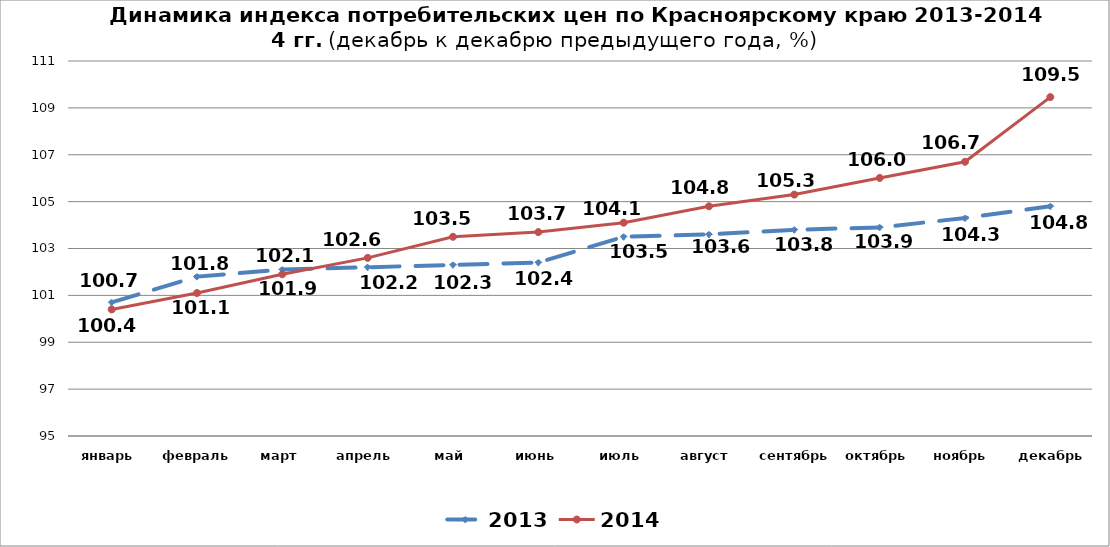
| Category | 2013 | 2014 |
|---|---|---|
| январь | 100.7 | 100.4 |
| февраль | 101.8 | 101.1 |
| март | 102.1 | 101.9 |
| апрель | 102.2 | 102.6 |
| май | 102.3 | 103.5 |
| июнь | 102.4 | 103.7 |
| июль | 103.5 | 104.1 |
| август | 103.6 | 104.8 |
| сентябрь | 103.8 | 105.3 |
| октябрь | 103.9 | 106.01 |
| ноябрь | 104.3 | 106.7 |
| декабрь | 104.8 | 109.46 |